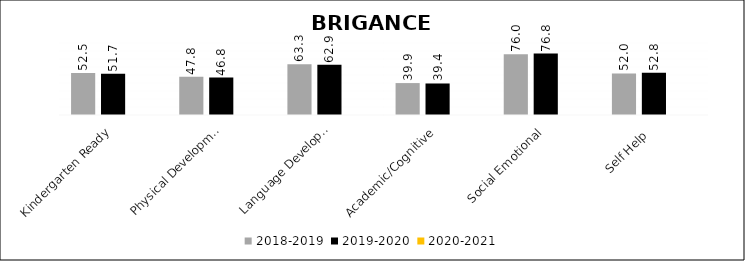
| Category | 2018-2019 | 2019-2020 | 2020-2021 |
|---|---|---|---|
| Kindergarten Ready | 52.5 | 51.7 | 0 |
| Physical Development | 47.8 | 46.8 | 0 |
| Language Development | 63.3 | 62.9 | 0 |
| Academic/Cognitive | 39.9 | 39.4 | 0 |
| Social Emotional | 76 | 76.8 | 0 |
| Self Help  | 52 | 52.8 | 0 |